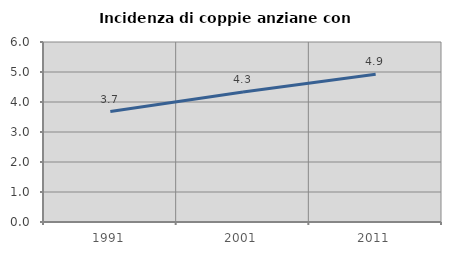
| Category | Incidenza di coppie anziane con figli |
|---|---|
| 1991.0 | 3.68 |
| 2001.0 | 4.332 |
| 2011.0 | 4.928 |